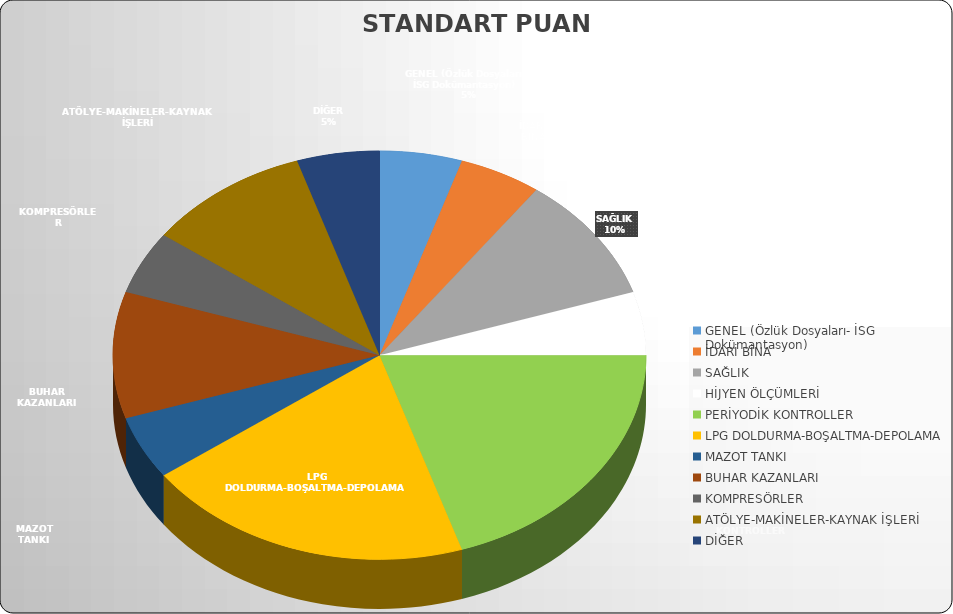
| Category | STANDART PUAN |
|---|---|
| GENEL (Özlük Dosyaları- İSG Dokümantasyon) | 50 |
| İDARİ BİNA | 50 |
| SAĞLIK  | 100 |
| HİJYEN ÖLÇÜMLERİ  | 50 |
| PERİYODİK KONTROLLER | 200 |
| LPG DOLDURMA-BOŞALTMA-DEPOLAMA | 200 |
| MAZOT TANKI | 50 |
| BUHAR KAZANLARI | 100 |
| KOMPRESÖRLER | 50 |
| ATÖLYE-MAKİNELER-KAYNAK İŞLERİ | 100 |
| DİĞER | 50 |